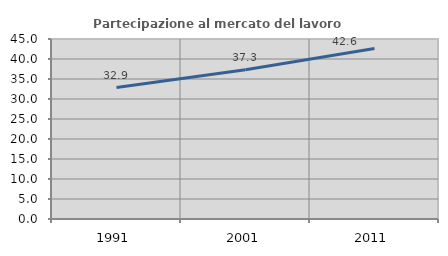
| Category | Partecipazione al mercato del lavoro  femminile |
|---|---|
| 1991.0 | 32.86 |
| 2001.0 | 37.321 |
| 2011.0 | 42.644 |